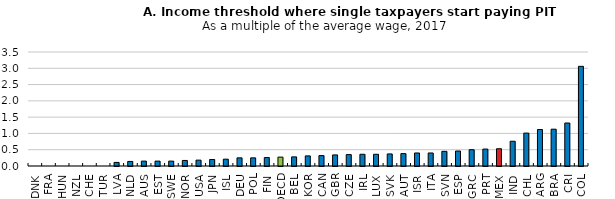
| Category | Income threshold where single taxpayers start paying income tax, measured as a multiple of the average wage |
|---|---|
| DNK | 0 |
| FRA | 0 |
| HUN | 0 |
| NZL | 0 |
| CHE | 0 |
| TUR | 0 |
| LVA | 0.11 |
| NLD | 0.14 |
| AUS | 0.15 |
| EST | 0.15 |
| SWE | 0.15 |
| NOR | 0.17 |
| USA | 0.18 |
| JPN | 0.2 |
| ISL | 0.21 |
| DEU | 0.25 |
| POL | 0.25 |
| FIN | 0.26 |
| OECD | 0.273 |
| BEL | 0.28 |
| KOR | 0.31 |
| CAN | 0.32 |
| GBR | 0.34 |
| CZE | 0.35 |
| IRL | 0.36 |
| LUX | 0.36 |
| SVK | 0.37 |
| AUT | 0.38 |
| ISR | 0.4 |
| ITA | 0.4 |
| SVN | 0.45 |
| ESP | 0.46 |
| GRC | 0.5 |
| PRT | 0.52 |
| MEX | 0.53 |
| IND | 0.76 |
| CHL | 1.01 |
| ARG | 1.12 |
| BRA | 1.13 |
| CRI | 1.32 |
| COL | 3.06 |